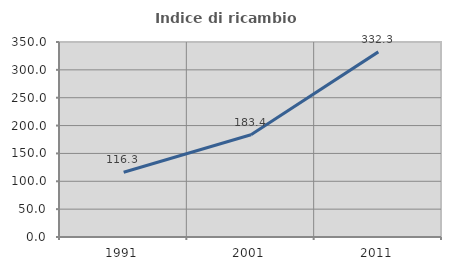
| Category | Indice di ricambio occupazionale  |
|---|---|
| 1991.0 | 116.32 |
| 2001.0 | 183.413 |
| 2011.0 | 332.276 |